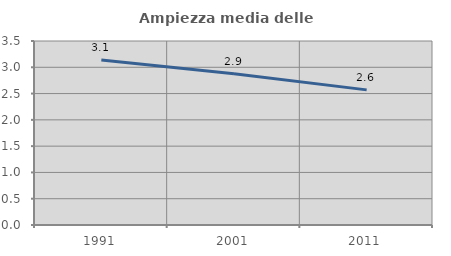
| Category | Ampiezza media delle famiglie |
|---|---|
| 1991.0 | 3.138 |
| 2001.0 | 2.876 |
| 2011.0 | 2.57 |